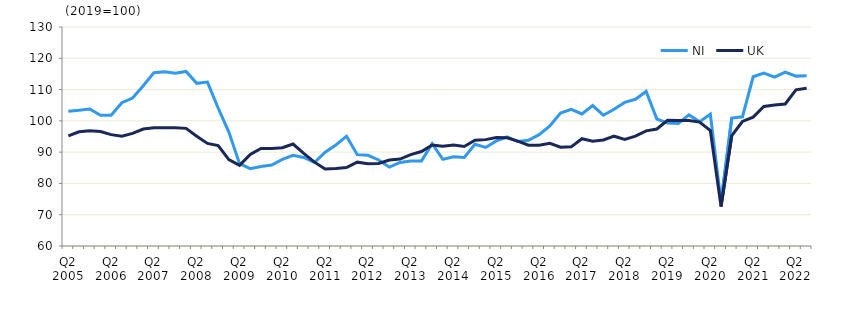
| Category | NI | UK  |
|---|---|---|
| Q2 2005 | 103.1 | 95.2 |
|  | 103.4 | 96.5 |
| Q4 2005 | 103.8 | 96.8 |
|  | 101.8 | 96.6 |
| Q2 2006 | 101.8 | 95.6 |
|  | 105.8 | 95.1 |
| Q4 2006 | 107.3 | 96 |
|  | 111.2 | 97.4 |
| Q2 2007 | 115.4 | 97.8 |
|  | 115.7 | 97.8 |
| Q4 2007 | 115.2 | 97.8 |
|  | 115.8 | 97.6 |
| Q2 2008 | 112 | 95.1 |
|  | 112.4 | 92.8 |
| Q4 2008 | 104.1 | 92.1 |
|  | 96.4 | 87.6 |
| Q2 2009 | 86.3 | 85.8 |
|  | 84.7 | 89.3 |
| Q4 2009 | 85.4 | 91.2 |
|  | 85.9 | 91.2 |
| Q2 2010 | 87.7 | 91.4 |
|  | 89 | 92.6 |
| Q4 2010 | 88.3 | 89.6 |
|  | 86.7 | 86.8 |
| Q2 2011 | 90 | 84.6 |
|  | 92.3 | 84.8 |
| Q4 2011 | 95.1 | 85.1 |
|  | 89.2 | 86.8 |
| Q2 2012 | 89 | 86.3 |
|  | 87.5 | 86.4 |
| Q4 2012 | 85.2 | 87.5 |
|  | 86.7 | 87.8 |
| Q2 2013 | 87.2 | 89.2 |
|  | 87.2 | 90.2 |
| Q4 2013 | 92.7 | 92.3 |
|  | 87.7 | 91.9 |
| Q2 2014 | 88.5 | 92.3 |
|  | 88.3 | 91.8 |
| Q4 2014 | 92.5 | 93.8 |
|  | 91.5 | 94 |
| Q2 2015 | 93.6 | 94.7 |
|  | 94.9 | 94.6 |
| Q4 2015 | 93.4 | 93.5 |
|  | 93.8 | 92.2 |
| Q2 2016 | 95.6 | 92.2 |
|  | 98.4 | 92.8 |
| Q4 2016 | 102.5 | 91.6 |
|  | 103.7 | 91.7 |
| Q2 2017 | 102.2 | 94.3 |
|  | 104.9 | 93.5 |
| Q4 2017 | 101.8 | 93.9 |
|  | 103.7 | 95.1 |
| Q2 2018 | 105.9 | 94.1 |
|  | 106.9 | 95.1 |
| Q4 2018 | 109.4 | 96.8 |
|  | 100.6 | 97.4 |
| Q2 2019 | 99.3 | 100.2 |
|  | 99.2 | 100.1 |
| Q4 2019 | 101.9 | 100.1 |
|  | 99.7 | 99.6 |
| Q2 2020 | 102.1 | 96.9 |
|  | 73.9 | 72.6 |
| Q4 2020 | 100.9 | 95.3 |
|  | 101.3 | 99.8 |
| Q2 2021 | 114.1 | 101.2 |
|  | 115.3 | 104.6 |
| Q4 2021 | 114 | 105.1 |
|  | 115.6 | 105.4 |
| Q2 2022 | 114.3 | 109.9 |